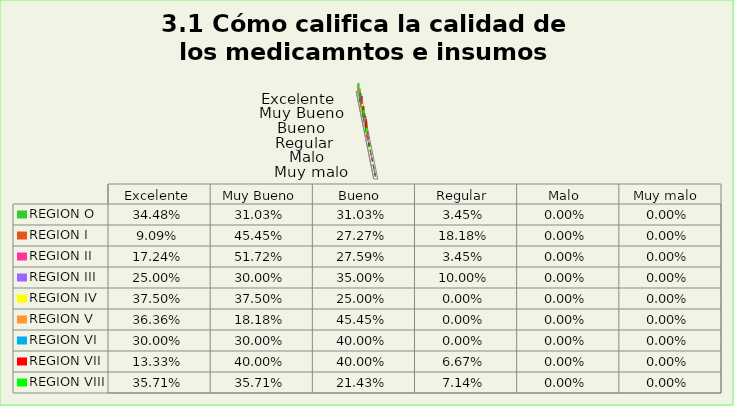
| Category | REGION O | REGION I  | REGION II | REGION III | REGION IV | REGION V  | REGION VI  | REGION VII  | REGION VIII |
|---|---|---|---|---|---|---|---|---|---|
| Excelente | 0.345 | 0.091 | 0.172 | 0.25 | 0.375 | 0.364 | 0.3 | 0.133 | 0.357 |
| Muy Bueno | 0.31 | 0.455 | 0.517 | 0.3 | 0.375 | 0.182 | 0.3 | 0.4 | 0.357 |
| Bueno  | 0.31 | 0.273 | 0.276 | 0.35 | 0.25 | 0.455 | 0.4 | 0.4 | 0.214 |
| Regular  | 0.034 | 0.182 | 0.034 | 0.1 | 0 | 0 | 0 | 0.067 | 0.071 |
| Malo  | 0 | 0 | 0 | 0 | 0 | 0 | 0 | 0 | 0 |
| Muy malo  | 0 | 0 | 0 | 0 | 0 | 0 | 0 | 0 | 0 |